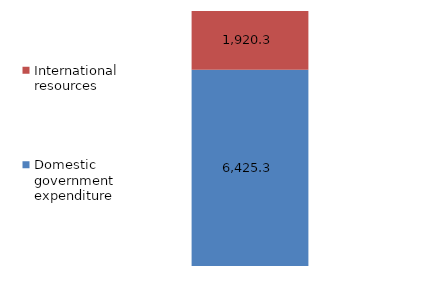
| Category | Domestic government expenditure | International resources |
|---|---|---|
| 0 | 6425.318 | 1920.328 |